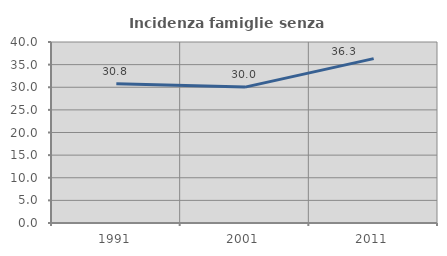
| Category | Incidenza famiglie senza nuclei |
|---|---|
| 1991.0 | 30.792 |
| 2001.0 | 30.032 |
| 2011.0 | 36.332 |